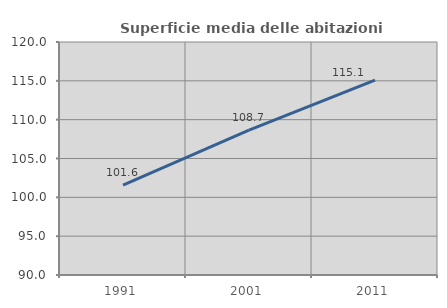
| Category | Superficie media delle abitazioni occupate |
|---|---|
| 1991.0 | 101.578 |
| 2001.0 | 108.665 |
| 2011.0 | 115.099 |